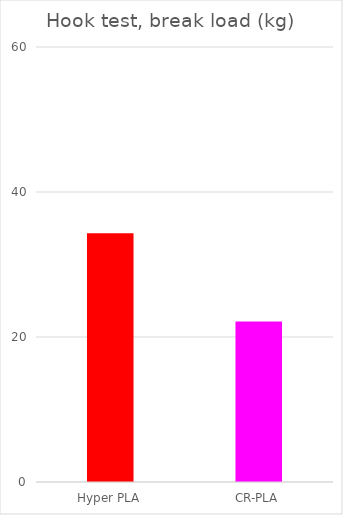
| Category | Average |
|---|---|
| Hyper PLA | 34.3 |
| CR-PLA | 22.15 |